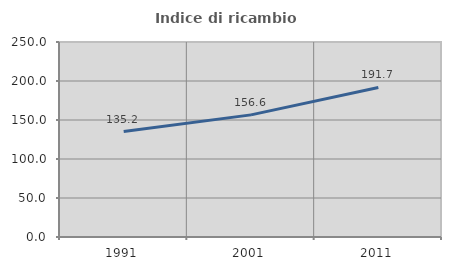
| Category | Indice di ricambio occupazionale  |
|---|---|
| 1991.0 | 135.156 |
| 2001.0 | 156.585 |
| 2011.0 | 191.702 |